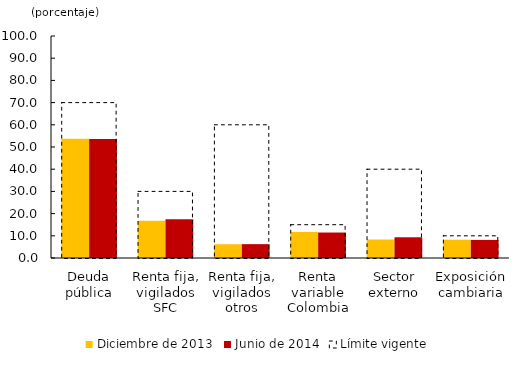
| Category | Diciembre de 2013 | Junio de 2014 |
|---|---|---|
| Deuda pública | 53.66 | 53.589 |
| Renta fija, vigilados SFC | 16.835 | 17.435 |
| Renta fija, vigilados otros | 6.189 | 6.239 |
| Renta variable Colombia | 11.76 | 11.472 |
| Sector externo | 8.314 | 9.333 |
| Exposición cambiaria | 8.24 | 8.151 |